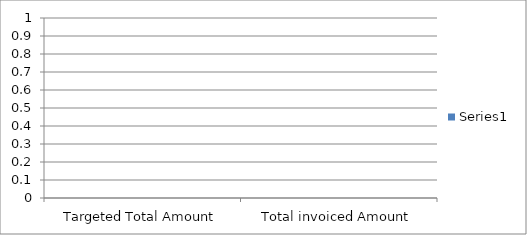
| Category | Series 0 |
|---|---|
| Targeted Total Amount | 0 |
| Total invoiced Amount | 0 |